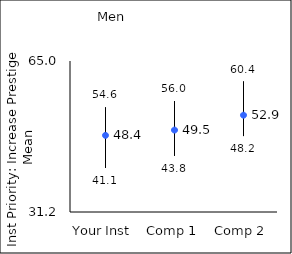
| Category | 25th percentile | 75th percentile | Mean |
|---|---|---|---|
| Your Inst | 41.1 | 54.6 | 48.35 |
| Comp 1 | 43.8 | 56 | 49.54 |
| Comp 2 | 48.2 | 60.4 | 52.87 |